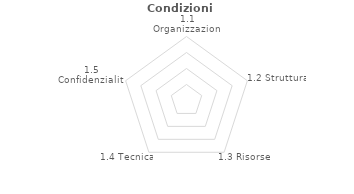
| Category | Series 2 |
|---|---|
| 1.1 Organizzazione | 0 |
| 1.2 Struttura | 0 |
| 1.3 Risorse | 0 |
| 1.4 Tecnica | 0 |
| 1.5 Confidenzialità | 0 |